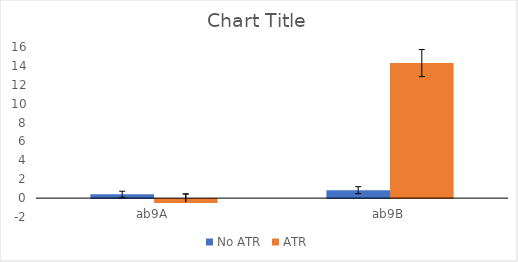
| Category | No ATR | ATR |
|---|---|---|
| ab9A | 0.4 | -0.4 |
| ab9B | 0.84 | 14.3 |